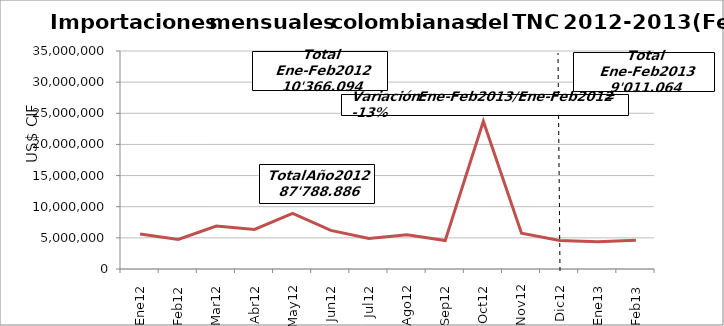
| Category | Series 0 |
|---|---|
| 0 | 5618763.82 |
| 1 | 4747330.02 |
| 2 | 6902155.57 |
| 3 | 6353459.87 |
| 4 | 8945142.61 |
| 5 | 6204028.01 |
| 6 | 4893004.76 |
| 7 | 5515984.08 |
| 8 | 4576394.4 |
| 9 | 23725169.3 |
| 10 | 5735731.84 |
| 11 | 4571722.14 |
| 12 | 4384624.31 |
| 13 | 4626439.77 |